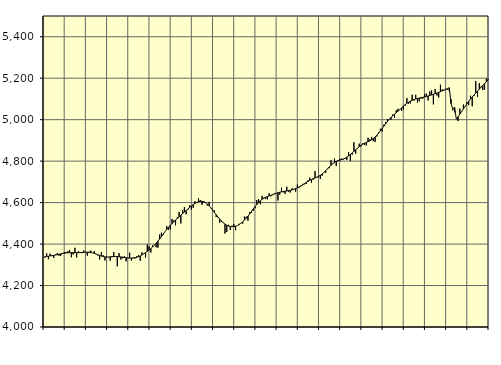
| Category | Piggar | Series 1 |
|---|---|---|
| nan | 4334.2 | 4339.69 |
| 1.0 | 4355.4 | 4340.64 |
| 1.0 | 4326.9 | 4341.66 |
| 1.0 | 4354.1 | 4342.77 |
| 1.0 | 4346.4 | 4343.97 |
| 1.0 | 4333.1 | 4345.29 |
| 1.0 | 4349.9 | 4347.05 |
| 1.0 | 4356.6 | 4348.73 |
| 1.0 | 4343.8 | 4350.78 |
| 1.0 | 4343.7 | 4352.78 |
| 1.0 | 4356.4 | 4354.63 |
| 1.0 | 4361.3 | 4356.15 |
| nan | 4360.5 | 4357.28 |
| 2.0 | 4365.7 | 4358.07 |
| 2.0 | 4371.5 | 4358.52 |
| 2.0 | 4336.2 | 4358.7 |
| 2.0 | 4349.8 | 4358.64 |
| 2.0 | 4382 | 4358.5 |
| 2.0 | 4335.7 | 4358.42 |
| 2.0 | 4366 | 4358.53 |
| 2.0 | 4361 | 4358.98 |
| 2.0 | 4356.2 | 4359.68 |
| 2.0 | 4369.2 | 4360.35 |
| 2.0 | 4361.3 | 4360.81 |
| nan | 4344.3 | 4360.84 |
| 3.0 | 4362.8 | 4360.28 |
| 3.0 | 4368.7 | 4359.13 |
| 3.0 | 4356.9 | 4357.38 |
| 3.0 | 4366.3 | 4355 |
| 3.0 | 4351.8 | 4352 |
| 3.0 | 4345 | 4348.61 |
| 3.0 | 4326.1 | 4345.21 |
| 3.0 | 4361.1 | 4342.1 |
| 3.0 | 4346.4 | 4339.65 |
| 3.0 | 4321 | 4338.04 |
| 3.0 | 4338.7 | 4337.37 |
| nan | 4336.6 | 4337.59 |
| 4.0 | 4319.8 | 4338.27 |
| 4.0 | 4342.5 | 4339.05 |
| 4.0 | 4361.2 | 4339.65 |
| 4.0 | 4338.8 | 4339.91 |
| 4.0 | 4292.6 | 4339.68 |
| 4.0 | 4356.1 | 4339.01 |
| 4.0 | 4325.3 | 4338.06 |
| 4.0 | 4331.2 | 4336.82 |
| 4.0 | 4341.5 | 4335.35 |
| 4.0 | 4316.5 | 4334.06 |
| 4.0 | 4332.6 | 4333.02 |
| nan | 4358.5 | 4332.24 |
| 5.0 | 4319.9 | 4332.03 |
| 5.0 | 4335.6 | 4332.52 |
| 5.0 | 4331.1 | 4333.72 |
| 5.0 | 4341.4 | 4335.78 |
| 5.0 | 4346.2 | 4338.94 |
| 5.0 | 4319.2 | 4342.96 |
| 5.0 | 4360.2 | 4347.56 |
| 5.0 | 4352.2 | 4352.71 |
| 5.0 | 4334.5 | 4358.34 |
| 5.0 | 4397.7 | 4364.35 |
| 5.0 | 4389.2 | 4370.87 |
| nan | 4359.3 | 4378.01 |
| 6.0 | 4393.1 | 4385.75 |
| 6.0 | 4393.9 | 4394.26 |
| 6.0 | 4384.5 | 4403.66 |
| 6.0 | 4382.9 | 4413.92 |
| 6.0 | 4446.1 | 4424.8 |
| 6.0 | 4455 | 4436.33 |
| 6.0 | 4444.4 | 4448.13 |
| 6.0 | 4459.9 | 4459.6 |
| 6.0 | 4487.4 | 4470.58 |
| 6.0 | 4469.2 | 4480.85 |
| 6.0 | 4471 | 4490.17 |
| nan | 4521.1 | 4498.87 |
| 7.0 | 4514.3 | 4507.31 |
| 7.0 | 4490.4 | 4515.5 |
| 7.0 | 4529.3 | 4523.61 |
| 7.0 | 4555 | 4531.63 |
| 7.0 | 4499.6 | 4539.42 |
| 7.0 | 4563 | 4546.91 |
| 7.0 | 4578.3 | 4554.3 |
| 7.0 | 4543.5 | 4561.73 |
| 7.0 | 4567 | 4569.19 |
| 7.0 | 4587.7 | 4576.52 |
| 7.0 | 4566.5 | 4583.65 |
| nan | 4574.8 | 4590.28 |
| 8.0 | 4606.3 | 4596.03 |
| 8.0 | 4602.5 | 4600.81 |
| 8.0 | 4621 | 4604.35 |
| 8.0 | 4612.4 | 4606.29 |
| 8.0 | 4589.3 | 4606.33 |
| 8.0 | 4600.1 | 4604.27 |
| 8.0 | 4600 | 4599.82 |
| 8.0 | 4585.8 | 4593.13 |
| 8.0 | 4603.3 | 4584.59 |
| 8.0 | 4573.1 | 4574.66 |
| 8.0 | 4565.7 | 4563.82 |
| nan | 4562.7 | 4552.57 |
| 9.0 | 4530.4 | 4541.34 |
| 9.0 | 4528.6 | 4530.44 |
| 9.0 | 4503 | 4520.19 |
| 9.0 | 4507.1 | 4510.88 |
| 9.0 | 4504.5 | 4502.85 |
| 9.0 | 4450.5 | 4496.2 |
| 9.0 | 4458.4 | 4490.91 |
| 9.0 | 4492.8 | 4487.11 |
| 9.0 | 4467.9 | 4484.73 |
| 9.0 | 4488.6 | 4483.73 |
| 9.0 | 4496.3 | 4484.2 |
| nan | 4466.8 | 4486.14 |
| 10.0 | 4489.2 | 4489.42 |
| 10.0 | 4498.1 | 4493.98 |
| 10.0 | 4500.3 | 4499.88 |
| 10.0 | 4498.6 | 4507.02 |
| 10.0 | 4532.6 | 4515.27 |
| 10.0 | 4532.1 | 4524.61 |
| 10.0 | 4512.4 | 4534.98 |
| 10.0 | 4554 | 4546.05 |
| 10.0 | 4550.7 | 4557.57 |
| 10.0 | 4560.2 | 4569.18 |
| 10.0 | 4572.7 | 4580.4 |
| nan | 4612 | 4590.89 |
| 11.0 | 4617.2 | 4600.41 |
| 11.0 | 4592 | 4608.72 |
| 11.0 | 4632.4 | 4615.62 |
| 11.0 | 4623.1 | 4621.19 |
| 11.0 | 4617.2 | 4625.68 |
| 11.0 | 4615.3 | 4629.26 |
| 11.0 | 4644.9 | 4632.39 |
| 11.0 | 4630.3 | 4635.45 |
| 11.0 | 4636 | 4638.49 |
| 11.0 | 4644.2 | 4641.61 |
| 11.0 | 4645.3 | 4644.75 |
| nan | 4610.2 | 4647.58 |
| 12.0 | 4638.2 | 4649.97 |
| 12.0 | 4671.8 | 4651.94 |
| 12.0 | 4649.7 | 4653.57 |
| 12.0 | 4641.9 | 4654.9 |
| 12.0 | 4676.6 | 4656.22 |
| 12.0 | 4650.9 | 4657.71 |
| 12.0 | 4648.6 | 4659.41 |
| 12.0 | 4669.2 | 4661.51 |
| 12.0 | 4662.9 | 4664.23 |
| 12.0 | 4652.6 | 4667.47 |
| 12.0 | 4686.9 | 4671.22 |
| nan | 4671.8 | 4675.55 |
| 13.0 | 4678.6 | 4680.49 |
| 13.0 | 4690.1 | 4685.94 |
| 13.0 | 4688.2 | 4691.57 |
| 13.0 | 4689.7 | 4697.22 |
| 13.0 | 4707.4 | 4702.58 |
| 13.0 | 4719.9 | 4707.42 |
| 13.0 | 4696 | 4711.69 |
| 13.0 | 4710.3 | 4715.44 |
| 13.0 | 4751.7 | 4718.85 |
| 13.0 | 4723.7 | 4722.47 |
| 13.0 | 4722.7 | 4726.73 |
| nan | 4713.8 | 4731.85 |
| 14.0 | 4729.5 | 4738.04 |
| 14.0 | 4746.3 | 4745.3 |
| 14.0 | 4744.1 | 4753.48 |
| 14.0 | 4763.7 | 4762.31 |
| 14.0 | 4765.9 | 4771.2 |
| 14.0 | 4804 | 4779.71 |
| 14.0 | 4789.5 | 4787.42 |
| 14.0 | 4812.4 | 4793.77 |
| 14.0 | 4776.7 | 4798.58 |
| 14.0 | 4799.9 | 4802.05 |
| 14.0 | 4810.7 | 4804.74 |
| nan | 4813.3 | 4807.28 |
| 15.0 | 4807.7 | 4810.22 |
| 15.0 | 4811.1 | 4814.01 |
| 15.0 | 4806.2 | 4818.97 |
| 15.0 | 4842.3 | 4825.03 |
| 15.0 | 4800.3 | 4831.94 |
| 15.0 | 4831.1 | 4839.31 |
| 15.0 | 4890.7 | 4846.9 |
| 15.0 | 4835.7 | 4854.65 |
| 15.0 | 4860.4 | 4862.29 |
| 15.0 | 4884.3 | 4869.53 |
| 15.0 | 4871.3 | 4875.9 |
| nan | 4886.2 | 4881.33 |
| 16.0 | 4878.3 | 4885.93 |
| 16.0 | 4875.2 | 4889.96 |
| 16.0 | 4913.2 | 4893.79 |
| 16.0 | 4905 | 4897.9 |
| 16.0 | 4916.7 | 4902.81 |
| 16.0 | 4896.2 | 4908.93 |
| 16.0 | 4892.4 | 4916.35 |
| 16.0 | 4918.5 | 4925.02 |
| 16.0 | 4937.9 | 4934.92 |
| 16.0 | 4956 | 4945.72 |
| 16.0 | 4943.2 | 4957.14 |
| nan | 4976.6 | 4968.93 |
| 17.0 | 4989 | 4980.64 |
| 17.0 | 5002.5 | 4991.73 |
| 17.0 | 5002.3 | 5001.84 |
| 17.0 | 5000.2 | 5010.87 |
| 17.0 | 5024.9 | 5018.92 |
| 17.0 | 5009 | 5026.38 |
| 17.0 | 5046 | 5033.62 |
| 17.0 | 5052.6 | 5040.98 |
| 17.0 | 5048.4 | 5048.61 |
| 17.0 | 5043 | 5056.49 |
| 17.0 | 5050.5 | 5064.43 |
| nan | 5067.9 | 5072.09 |
| 18.0 | 5104.7 | 5078.97 |
| 18.0 | 5077 | 5084.96 |
| 18.0 | 5078.5 | 5089.93 |
| 18.0 | 5120.4 | 5093.85 |
| 18.0 | 5092.4 | 5097.09 |
| 18.0 | 5119.8 | 5099.7 |
| 18.0 | 5082.9 | 5101.91 |
| 18.0 | 5088.3 | 5103.92 |
| 18.0 | 5101.8 | 5105.79 |
| 18.0 | 5102 | 5107.68 |
| 18.0 | 5123.6 | 5109.7 |
| nan | 5125.9 | 5111.87 |
| 19.0 | 5092.9 | 5114.18 |
| 19.0 | 5136.7 | 5116.7 |
| 19.0 | 5141.6 | 5119.43 |
| 19.0 | 5073.7 | 5122.24 |
| 19.0 | 5147.1 | 5125.16 |
| 19.0 | 5116.2 | 5128.29 |
| 19.0 | 5106.5 | 5131.68 |
| 19.0 | 5168.5 | 5135.23 |
| 19.0 | 5146.1 | 5138.78 |
| 19.0 | 5143.9 | 5142.2 |
| 19.0 | 5149.3 | 5145.62 |
| nan | 5145.4 | 5149.33 |
| 20.0 | 5137.8 | 5153.9 |
| 20.0 | 5099.5 | 5077.32 |
| 20.0 | 5044.9 | 5051.14 |
| 20.0 | 5035.5 | 5060.44 |
| 20.0 | 5003.1 | 5002.22 |
| 20.0 | 4993.2 | 5014.13 |
| 20.0 | 5053.3 | 5026.73 |
| 20.0 | 5037.9 | 5039.5 |
| 20.0 | 5072.8 | 5052.11 |
| 20.0 | 5063.2 | 5064.61 |
| 20.0 | 5084 | 5076.73 |
| nan | 5069.7 | 5088.26 |
| 21.0 | 5115.4 | 5099.16 |
| 21.0 | 5064.5 | 5109.37 |
| 21.0 | 5114.3 | 5118.97 |
| 21.0 | 5185.4 | 5128.32 |
| 21.0 | 5110.5 | 5137.61 |
| 21.0 | 5175.7 | 5146.81 |
| 21.0 | 5159.6 | 5155.97 |
| 21.0 | 5142.6 | 5165.01 |
| 21.0 | 5145.3 | 5174.08 |
| 21.0 | 5197.7 | 5183.23 |
| 21.0 | 5196.7 | 5192.62 |